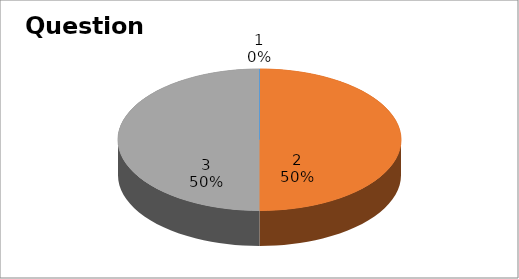
| Category | Series 0 |
|---|---|
| 0 | 0 |
| 1 | 4 |
| 2 | 4 |